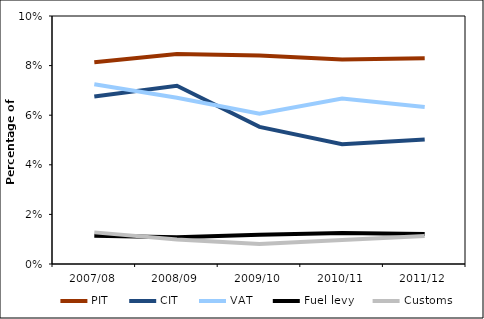
| Category | PIT | CIT | VAT | Fuel levy | Customs |
|---|---|---|---|---|---|
| 2007/08 | 0.081 | 0.068 | 0.072 | 0.011 | 0.013 |
| 2008/09 | 0.085 | 0.072 | 0.067 | 0.011 | 0.01 |
| 2009/10 | 0.084 | 0.055 | 0.061 | 0.012 | 0.008 |
| 2010/11 | 0.082 | 0.048 | 0.067 | 0.013 | 0.01 |
| 2011/12 | 0.083 | 0.05 | 0.063 | 0.012 | 0.011 |